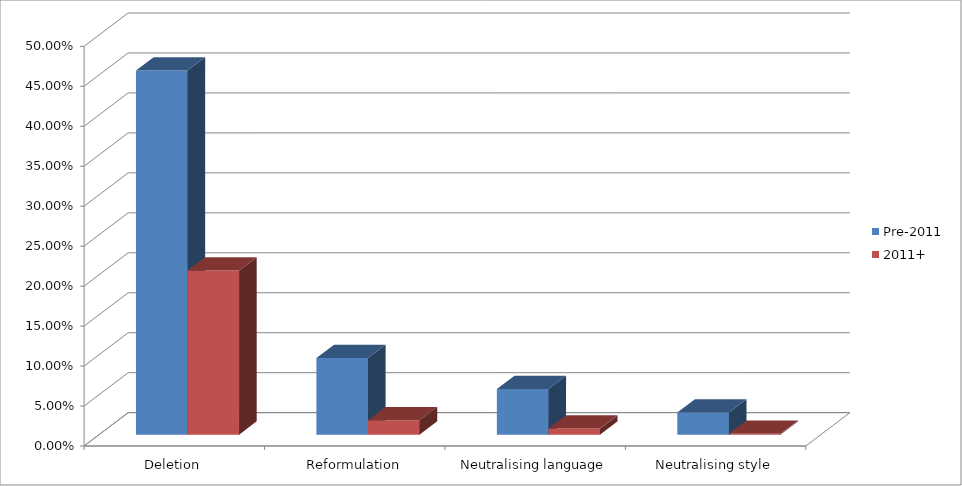
| Category | Pre-2011 | 2011+ |
|---|---|---|
| Deletion | 0.456 | 0.205 |
| Reformulation | 0.096 | 0.018 |
| Neutralising language | 0.057 | 0.008 |
| Neutralising style | 0.028 | 0.001 |